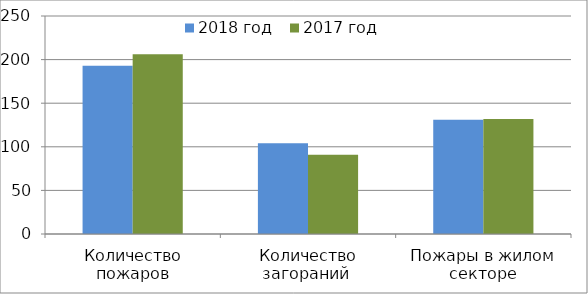
| Category | 2018 год | 2017 год |
|---|---|---|
| Количество пожаров | 193 | 206 |
| Количество загораний  | 104 | 91 |
| Пожары в жилом секторе | 131 | 132 |